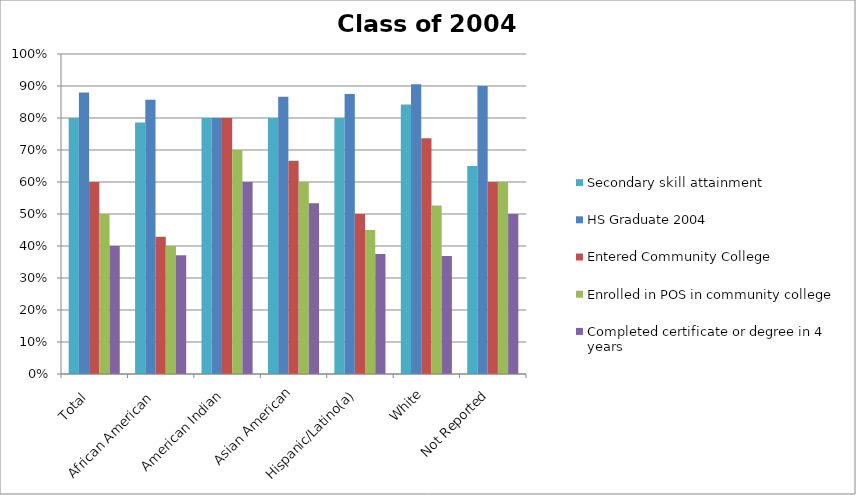
| Category | Secondary skill attainment | HS Graduate 2004 | Entered Community College | Enrolled in POS in community college | Completed certificate or degree in 4 years |
|---|---|---|---|---|---|
| Total  | 0.8 | 0.88 | 0.6 | 0.5 | 0.4 |
| African American  | 0.786 | 0.857 | 0.429 | 0.4 | 0.371 |
| American Indian | 0.8 | 0.8 | 0.8 | 0.7 | 0.6 |
| Asian American | 0.8 | 0.867 | 0.667 | 0.6 | 0.533 |
| Hispanic/Latino(a) | 0.8 | 0.875 | 0.5 | 0.45 | 0.375 |
| White | 0.842 | 0.905 | 0.737 | 0.526 | 0.368 |
| Not Reported | 0.65 | 0.9 | 0.6 | 0.6 | 0.5 |